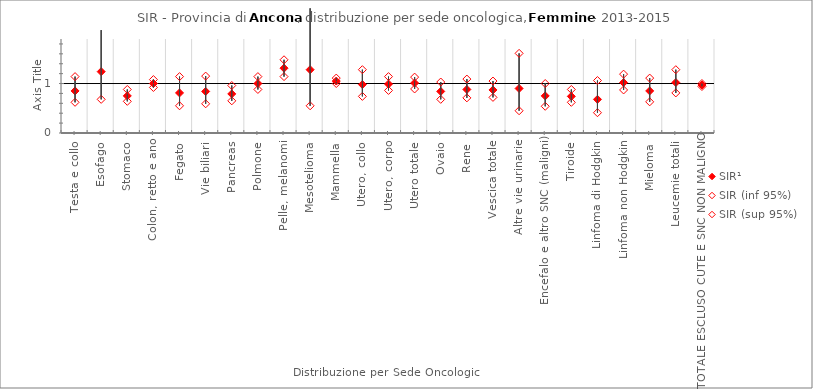
| Category | SIR¹ | SIR (inf 95%) | SIR (sup 95%) |
|---|---|---|---|
| Testa e collo | 0.85 | 0.62 | 1.14 |
| Esofago | 1.24 | 0.68 | 2.08 |
| Stomaco | 0.75 | 0.64 | 0.88 |
| Colon, retto e ano | 1 | 0.92 | 1.08 |
| Fegato | 0.81 | 0.55 | 1.14 |
| Vie biliari | 0.84 | 0.59 | 1.15 |
| Pancreas | 0.79 | 0.65 | 0.96 |
| Polmone | 1 | 0.88 | 1.14 |
| Pelle, melanomi | 1.31 | 1.14 | 1.48 |
| Mesotelioma | 1.28 | 0.55 | 2.52 |
| Mammella | 1.05 | 1 | 1.11 |
| Utero, collo | 0.98 | 0.74 | 1.28 |
| Utero, corpo | 0.99 | 0.86 | 1.14 |
| Utero totale | 1.01 | 0.89 | 1.13 |
| Ovaio | 0.84 | 0.68 | 1.03 |
| Rene | 0.88 | 0.71 | 1.09 |
| Vescica totale | 0.87 | 0.72 | 1.05 |
| Altre vie urinarie | 0.9 | 0.45 | 1.61 |
| Encefalo e altro SNC (maligni) | 0.75 | 0.54 | 1 |
| Tiroide | 0.74 | 0.62 | 0.88 |
| Linfoma di Hodgkin | 0.68 | 0.41 | 1.06 |
| Linfoma non Hodgkin | 1.02 | 0.87 | 1.19 |
| Mieloma | 0.85 | 0.63 | 1.11 |
| Leucemie totali | 1.02 | 0.81 | 1.28 |
| TOTALE ESCLUSO CUTE E SNC NON MALIGNO | 0.97 | 0.94 | 1 |